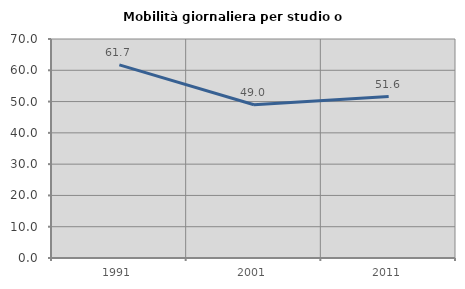
| Category | Mobilità giornaliera per studio o lavoro |
|---|---|
| 1991.0 | 61.739 |
| 2001.0 | 48.968 |
| 2011.0 | 51.584 |